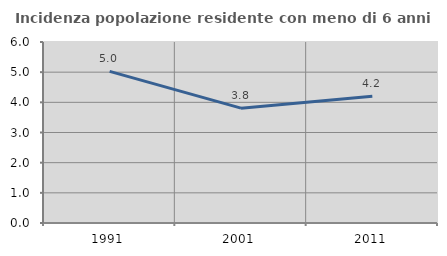
| Category | Incidenza popolazione residente con meno di 6 anni |
|---|---|
| 1991.0 | 5.026 |
| 2001.0 | 3.806 |
| 2011.0 | 4.198 |